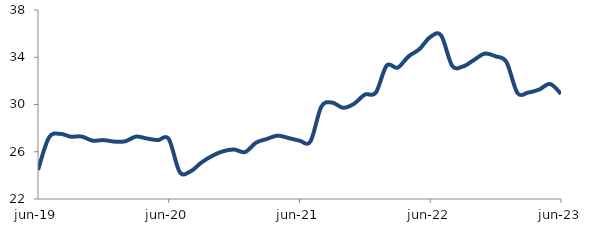
| Category | Series 0 |
|---|---|
| 2019-06-01 | 24.467 |
| 2019-07-01 | 27.194 |
| 2019-08-01 | 27.519 |
| 2019-09-01 | 27.279 |
| 2019-10-01 | 27.289 |
| 2019-11-01 | 26.942 |
| 2019-12-01 | 26.986 |
| 2020-01-01 | 26.86 |
| 2020-02-01 | 26.885 |
| 2020-03-01 | 27.282 |
| 2020-04-01 | 27.118 |
| 2020-05-01 | 26.986 |
| 2020-06-01 | 27.082 |
| 2020-07-01 | 24.291 |
| 2020-08-01 | 24.343 |
| 2020-09-01 | 25.089 |
| 2020-10-01 | 25.658 |
| 2020-11-01 | 26.044 |
| 2020-12-01 | 26.188 |
| 2021-01-01 | 25.972 |
| 2021-02-01 | 26.764 |
| 2021-03-01 | 27.083 |
| 2021-04-01 | 27.363 |
| 2021-05-01 | 27.164 |
| 2021-06-01 | 26.939 |
| 2021-07-01 | 26.864 |
| 2021-08-01 | 29.808 |
| 2021-09-01 | 30.158 |
| 2021-10-01 | 29.722 |
| 2021-11-01 | 30.058 |
| 2021-12-01 | 30.839 |
| 2022-01-01 | 30.999 |
| 2022-02-01 | 33.297 |
| 2022-03-01 | 33.114 |
| 2022-04-01 | 34.066 |
| 2022-05-01 | 34.685 |
| 2022-06-01 | 35.71 |
| 2022-07-01 | 35.85 |
| 2022-08-01 | 33.294 |
| 2022-09-01 | 33.218 |
| 2022-10-01 | 33.762 |
| 2022-11-01 | 34.307 |
| 2022-12-01 | 34.079 |
| 2023-01-01 | 33.585 |
| 2023-02-01 | 30.978 |
| 2023-03-01 | 31.014 |
| 2023-04-01 | 31.263 |
| 2023-05-01 | 31.74 |
| 2023-06-01 | 30.902 |